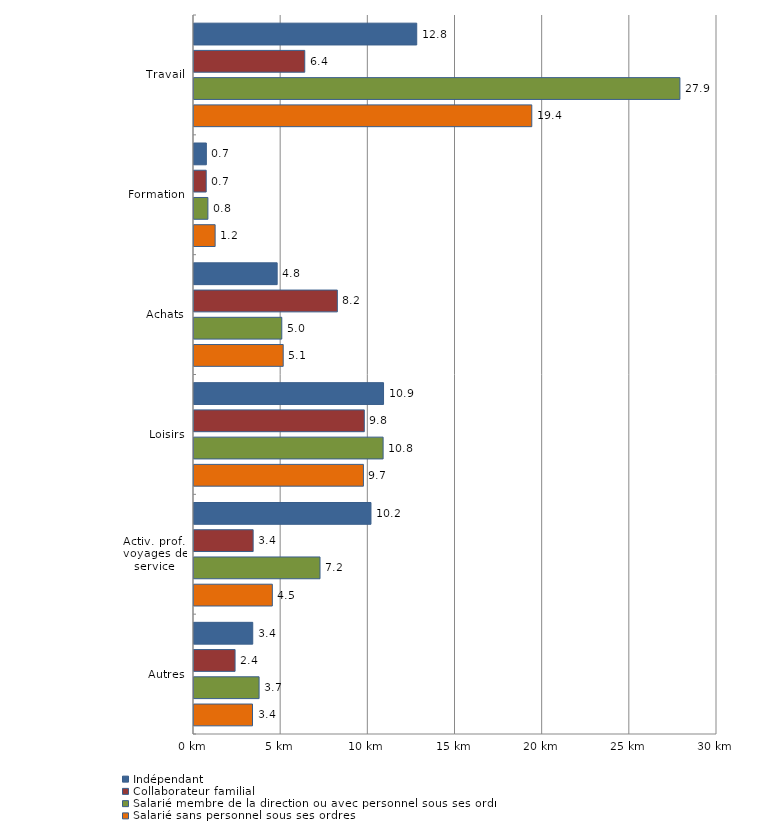
| Category | Indépendant | Collaborateur familial | Salarié membre de la direction ou avec personnel sous ses ordres | Salarié sans personnel sous ses ordres |
|---|---|---|---|---|
| Travail | 12.776 | 6.353 | 27.873 | 19.376 |
| Formation | 0.708 | 0.7 | 0.797 | 1.212 |
| Achats | 4.771 | 8.222 | 5.036 | 5.117 |
| Loisirs | 10.872 | 9.769 | 10.848 | 9.718 |
| Activ. prof., voyages de service | 10.151 | 3.393 | 7.228 | 4.494 |
|  Autres | 3.37 | 2.356 | 3.733 | 3.356 |